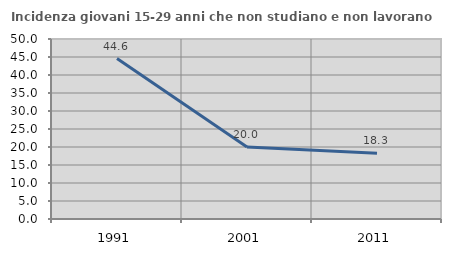
| Category | Incidenza giovani 15-29 anni che non studiano e non lavorano  |
|---|---|
| 1991.0 | 44.56 |
| 2001.0 | 20.018 |
| 2011.0 | 18.286 |